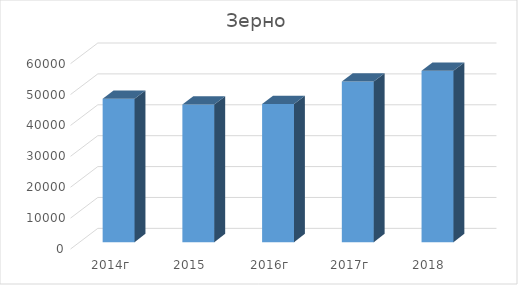
| Category | Зерно |
|---|---|
| 2014г | 46376 |
| 2015 | 44554 |
| 2016г | 44682 |
| 2017г | 52000 |
| 2018 | 55500 |